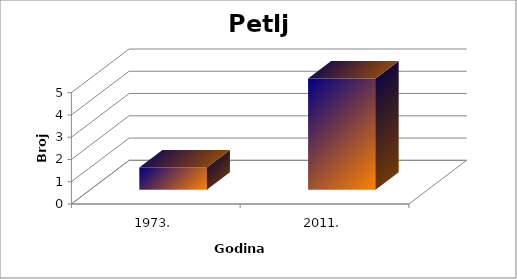
| Category | Broj Primjeraka |
|---|---|
| 1973. | 1 |
| 2011. | 5 |